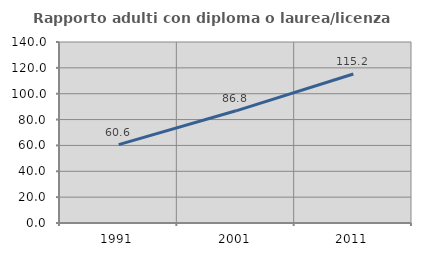
| Category | Rapporto adulti con diploma o laurea/licenza media  |
|---|---|
| 1991.0 | 60.588 |
| 2001.0 | 86.778 |
| 2011.0 | 115.22 |